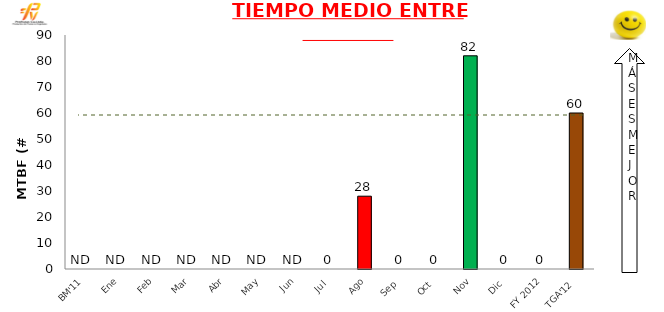
| Category | Mensual |
|---|---|
| BM'11 | 0 |
| Ene | 0 |
| Feb | 0 |
| Mar | 0 |
| Abr | 0 |
| May | 0 |
| Jun | 0 |
| Jul | 0 |
| Ago | 28 |
| Sep | 0 |
| Oct | 0 |
| Nov | 82 |
| Dic | 0 |
| FY 2012 | 0 |
| TGA'12 | 60 |